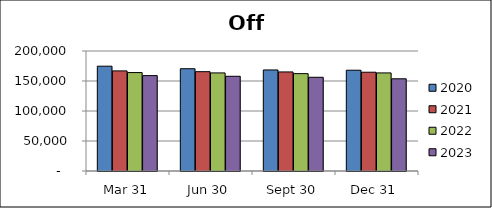
| Category | 2020 | 2021 | 2022 | 2023 |
|---|---|---|---|---|
| Mar 31 | 174680 | 166871 | 164055 | 158967 |
| Jun 30 | 170450 | 165532 | 163468 | 157850 |
| Sept 30 | 168432 | 165130 | 162276 | 156176 |
| Dec 31 | 167954 | 164614 | 163472 | 153667 |